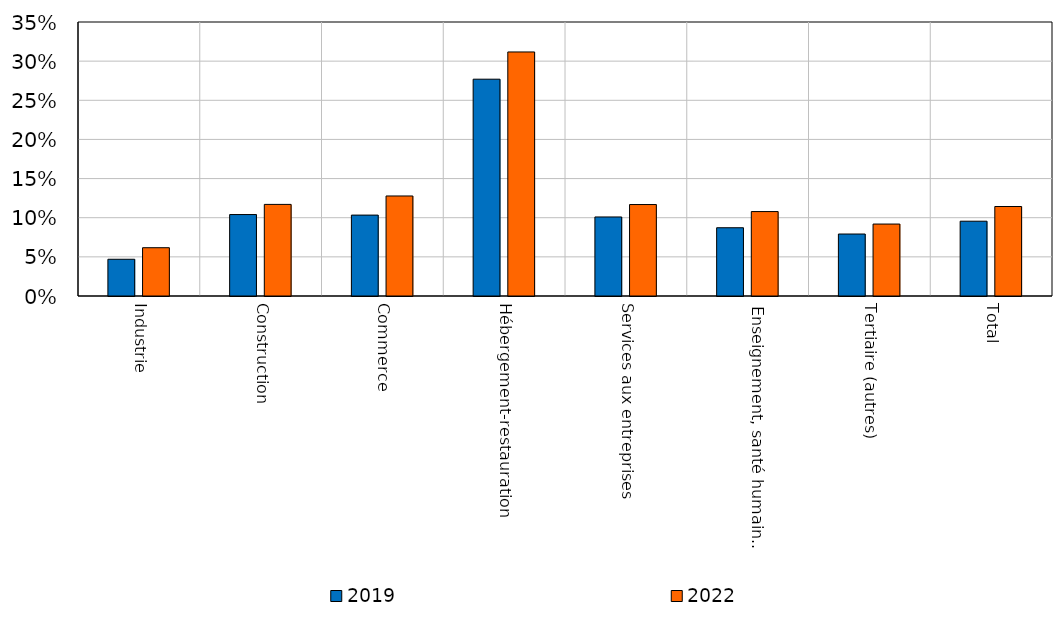
| Category | 2019 | 2022 |
|---|---|---|
| Industrie | 0.047 | 0.062 |
| Construction | 0.104 | 0.117 |
| Commerce | 0.103 | 0.128 |
| Hébergement-restauration | 0.277 | 0.312 |
| Services aux entreprises | 0.101 | 0.117 |
| Enseignement, santé humaine et action sociale | 0.087 | 0.108 |
| Tertiaire (autres) | 0.079 | 0.092 |
| Total | 0.096 | 0.114 |